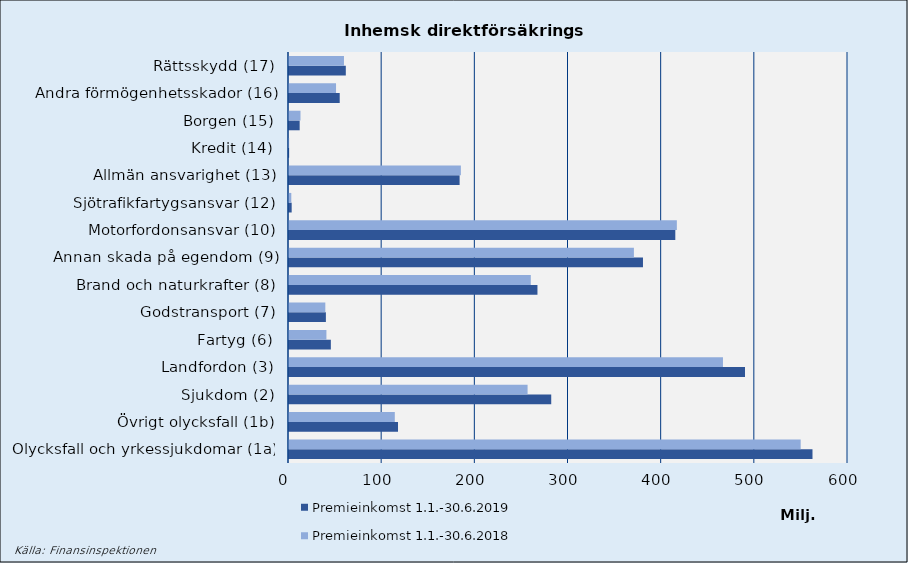
| Category | Premieinkomst |
|---|---|
| Olycksfall och yrkessjukdomar (1a) | 549203.912 |
| Övrigt olycksfall (1b) | 113559.162 |
| Sjukdom (2) | 256082.763 |
| Landfordon (3) | 465785.923 |
| Fartyg (6) | 40167.904 |
| Godstransport (7) | 38987.667 |
| Brand och naturkrafter (8) | 259536.578 |
| Annan skada på egendom (9) | 370203.097 |
| Motorfordonsansvar (10) | 416293.365 |
| Sjötrafikfartygsansvar (12) | 2468.44 |
| Allmän ansvarighet (13) | 184474.955 |
| Kredit (14) | 140.949 |
| Borgen (15) | 12339.334 |
| Andra förmögenhetsskador (16) | 50491.37 |
| Rättsskydd (17) | 59005.338 |